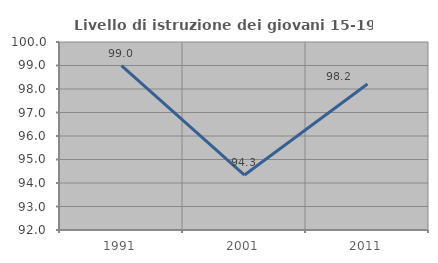
| Category | Livello di istruzione dei giovani 15-19 anni |
|---|---|
| 1991.0 | 98.99 |
| 2001.0 | 94.34 |
| 2011.0 | 98.214 |